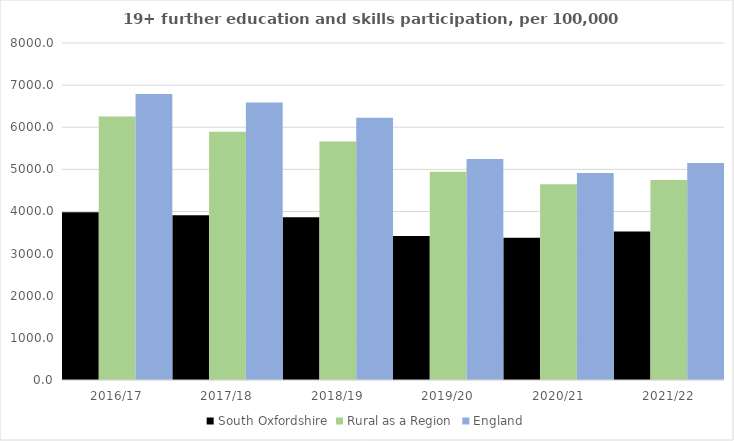
| Category | South Oxfordshire | Rural as a Region | England |
|---|---|---|---|
| 2016/17 | 3985 | 6253.401 | 6788 |
| 2017/18 | 3910 | 5892.029 | 6588 |
| 2018/19 | 3863 | 5661.873 | 6227 |
| 2019/20 | 3417 | 4943.801 | 5244 |
| 2020/21 | 3376 | 4646.727 | 4913 |
| 2021/22 | 3528 | 4747.049 | 5151 |